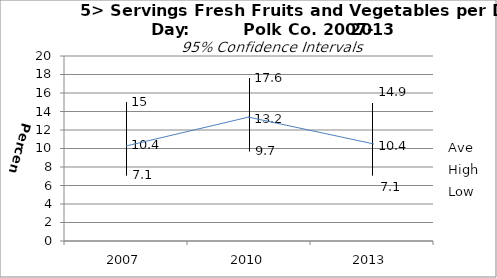
| Category | Ave | High | Low |
|---|---|---|---|
| 2007.0 | 10.4 | 15 | 7.1 |
| 2010.0 | 13.2 | 17.6 | 9.7 |
| 2013.0 | 10.4 | 14.9 | 7.1 |